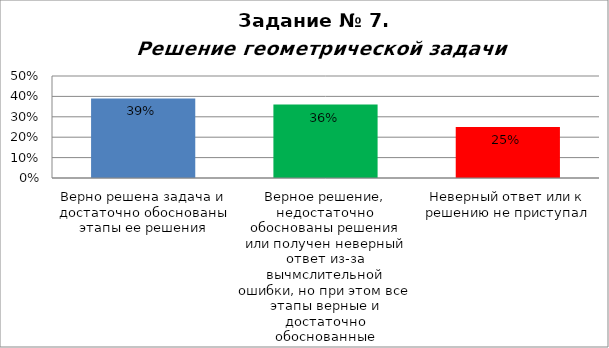
| Category | Решение геометрической задачи  |
|---|---|
| Верно решена задача и достаточно обоснованы этапы ее решения | 0.39 |
| Верное решение, недостаточно обоснованы решения или получен неверный ответ из-за вычмслительной ошибки, но при этом все этапы верные и достаточно обоснованные | 0.36 |
| Неверный ответ или к решению не приступал | 0.25 |